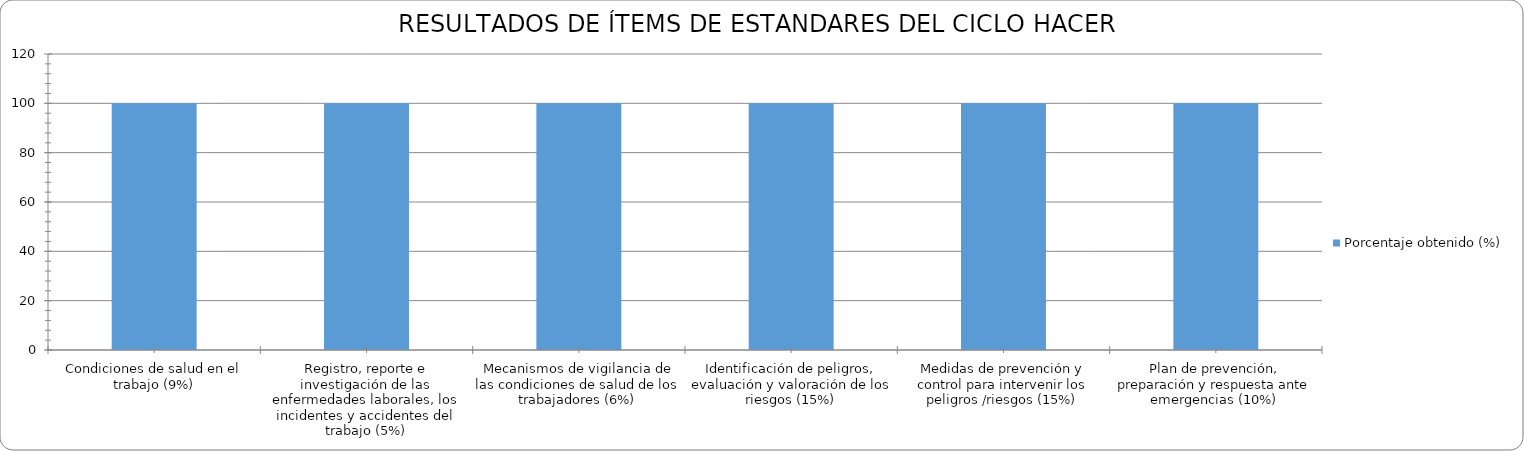
| Category | Porcentaje obtenido (%) |
|---|---|
| Condiciones de salud en el trabajo (9%) | 100 |
| Registro, reporte e investigación de las enfermedades laborales, los incidentes y accidentes del trabajo (5%) | 100 |
| Mecanismos de vigilancia de las condiciones de salud de los trabajadores (6%) | 100 |
| Identificación de peligros, evaluación y valoración de los riesgos (15%) | 100 |
| Medidas de prevención y control para intervenir los peligros /riesgos (15%) | 100 |
| Plan de prevención, preparación y respuesta ante emergencias (10%) | 100 |